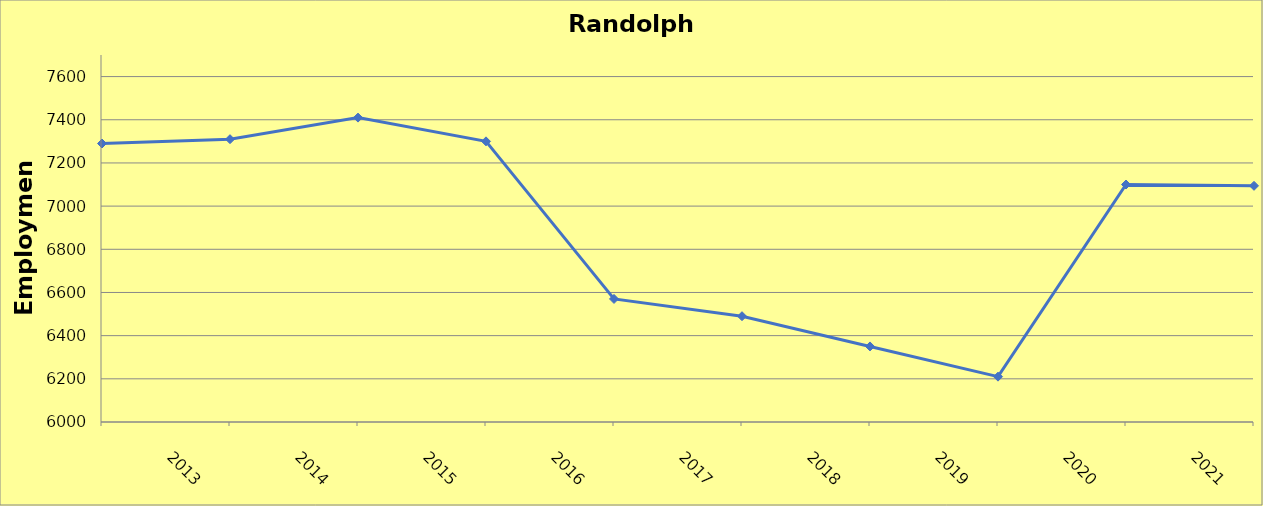
| Category | Randolph County |
|---|---|
| 2013.0 | 7290 |
| 2014.0 | 7310 |
| 2015.0 | 7410 |
| 2016.0 | 7300 |
| 2017.0 | 6570 |
| 2018.0 | 6490 |
| 2019.0 | 6350 |
| 2020.0 | 6210 |
| 2021.0 | 7100 |
| 2022.0 | 7094 |